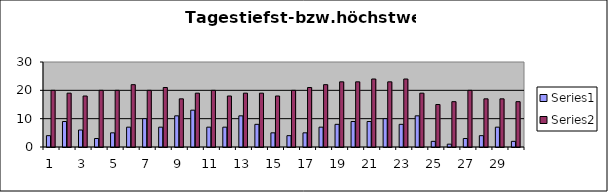
| Category | Series 0 | Series 1 |
|---|---|---|
| 0 | 4 | 20 |
| 1 | 9 | 19 |
| 2 | 6 | 18 |
| 3 | 3 | 20 |
| 4 | 5 | 20 |
| 5 | 7 | 22 |
| 6 | 10 | 20 |
| 7 | 7 | 21 |
| 8 | 11 | 17 |
| 9 | 13 | 19 |
| 10 | 7 | 20 |
| 11 | 7 | 18 |
| 12 | 11 | 19 |
| 13 | 8 | 19 |
| 14 | 5 | 18 |
| 15 | 4 | 20 |
| 16 | 5 | 21 |
| 17 | 7 | 22 |
| 18 | 8 | 23 |
| 19 | 9 | 23 |
| 20 | 9 | 24 |
| 21 | 10 | 23 |
| 22 | 8 | 24 |
| 23 | 11 | 19 |
| 24 | 2 | 15 |
| 25 | 1 | 16 |
| 26 | 3 | 20 |
| 27 | 4 | 17 |
| 28 | 7 | 17 |
| 29 | 2 | 16 |